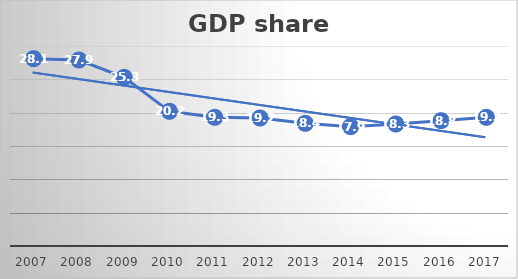
| Category | GDP share (%) |
|---|---|
| 2007.0 | 28.1 |
| 2008.0 | 27.9 |
| 2009.0 | 25.3 |
| 2010.0 | 20.2 |
| 2011.0 | 19.3 |
| 2012.0 | 19.2 |
| 2013.0 | 18.4 |
| 2014.0 | 17.9 |
| 2015.0 | 18.3 |
| 2016.0 | 18.8 |
| 2017.0 | 19.3 |